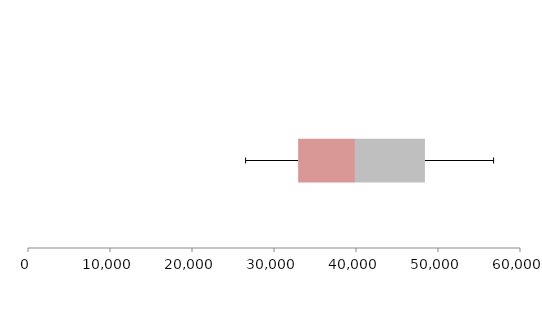
| Category | Series 1 | Series 2 | Series 3 |
|---|---|---|---|
| 0 | 32943.739 | 6926.934 | 8536.111 |